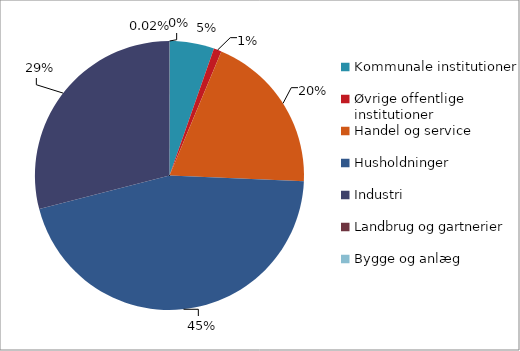
| Category | Series 0 |
|---|---|
| Kommunale institutioner | 31051 |
| Øvrige offentlige institutioner | 5417 |
| Handel og service | 112208 |
| Husholdninger | 262337 |
| Industri | 167789 |
| Landbrug og gartnerier | 105 |
| Bygge og anlæg | 0 |